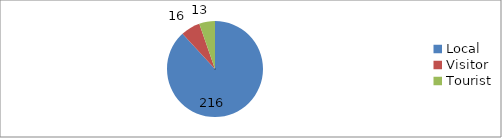
| Category | Series 0 |
|---|---|
| Local | 216 |
| Visitor | 16 |
| Tourist | 13 |